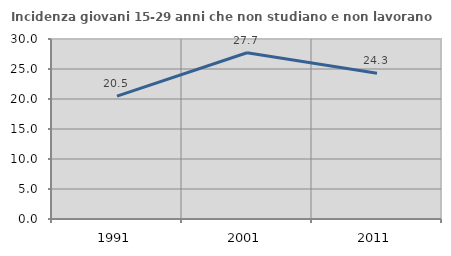
| Category | Incidenza giovani 15-29 anni che non studiano e non lavorano  |
|---|---|
| 1991.0 | 20.474 |
| 2001.0 | 27.702 |
| 2011.0 | 24.297 |